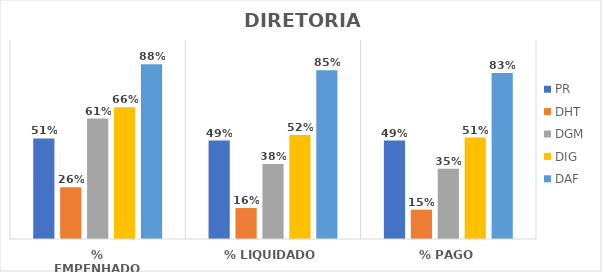
| Category | PR | DHT | DGM | DIG | DAF |
|---|---|---|---|---|---|
| % EMPENHADO | 0.506 | 0.26 | 0.605 | 0.662 | 0.879 |
| % LIQUIDADO | 0.495 | 0.155 | 0.377 | 0.522 | 0.848 |
| % PAGO | 0.495 | 0.147 | 0.354 | 0.51 | 0.835 |